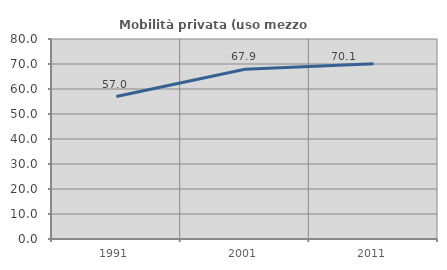
| Category | Mobilità privata (uso mezzo privato) |
|---|---|
| 1991.0 | 56.976 |
| 2001.0 | 67.883 |
| 2011.0 | 70.088 |